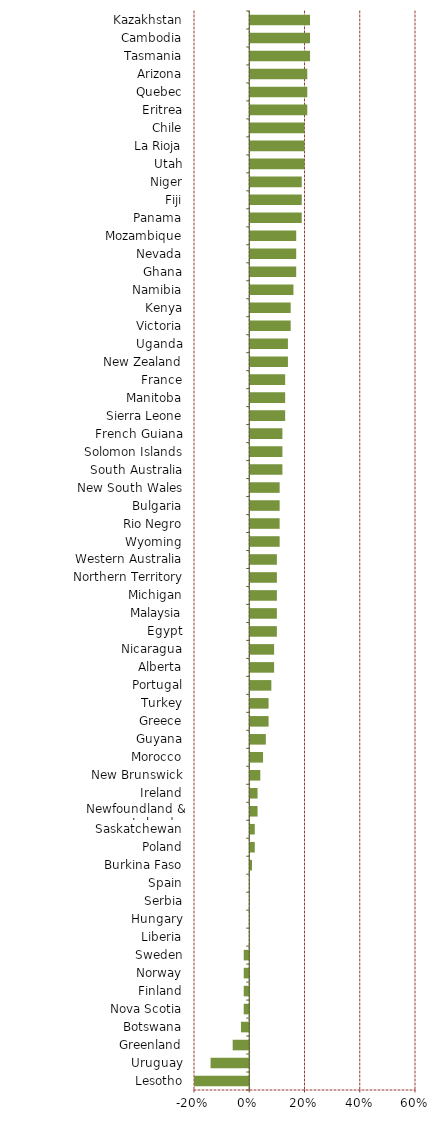
| Category | Series 0 |
|---|---|
| Lesotho | -0.2 |
| Uruguay | -0.14 |
| Greenland | -0.06 |
| Botswana | -0.03 |
| Nova Scotia | -0.02 |
| Finland | -0.02 |
| Norway | -0.02 |
| Sweden | -0.02 |
| Liberia | 0 |
| Hungary | 0 |
| Serbia | 0 |
| Spain | 0 |
| Burkina Faso | 0.01 |
| Poland | 0.02 |
| Saskatchewan | 0.02 |
| Newfoundland & Labrador | 0.03 |
| Ireland | 0.03 |
| New Brunswick | 0.04 |
| Morocco | 0.05 |
| Guyana | 0.06 |
| Greece | 0.07 |
| Turkey | 0.07 |
| Portugal | 0.08 |
| Alberta | 0.09 |
| Nicaragua | 0.09 |
| Egypt | 0.1 |
| Malaysia | 0.1 |
| Michigan | 0.1 |
| Northern Territory | 0.1 |
| Western Australia | 0.1 |
| Wyoming | 0.11 |
| Rio Negro | 0.11 |
| Bulgaria | 0.11 |
| New South Wales | 0.11 |
| South Australia | 0.12 |
| Solomon Islands | 0.12 |
| French Guiana | 0.12 |
| Sierra Leone | 0.13 |
| Manitoba | 0.13 |
| France | 0.13 |
| New Zealand | 0.14 |
| Uganda | 0.14 |
| Victoria | 0.15 |
| Kenya | 0.15 |
| Namibia | 0.16 |
| Ghana | 0.17 |
| Nevada | 0.17 |
| Mozambique | 0.17 |
| Panama | 0.19 |
| Fiji | 0.19 |
| Niger | 0.19 |
| Utah | 0.2 |
| La Rioja | 0.2 |
| Chile | 0.2 |
| Eritrea | 0.21 |
| Quebec | 0.21 |
| Arizona | 0.21 |
| Tasmania | 0.22 |
| Cambodia | 0.22 |
| Kazakhstan | 0.22 |